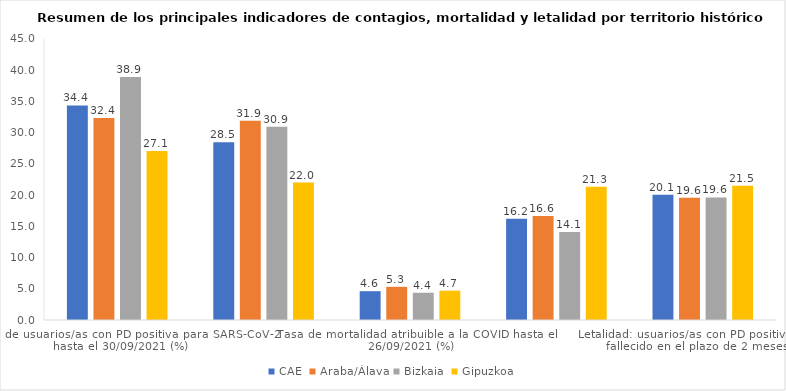
| Category | CAE | Araba/Álava | Bizkaia | Gipuzkoa |
|---|---|---|---|---|
| Tasa de usuarios/as con PD positiva para SARS-CoV-2 hasta el 30/09/2021 (%) | 34.355 | 32.359 | 38.903 | 27.073 |
| Tasa de mortalidad por todas las causas hasta el 26/09/2021 (%) | 28.461 | 31.927 | 30.934 | 22.016 |
| Tasa de mortalidad atribuible a la COVID hasta el 26/09/2021 (%) | 4.614 | 5.313 | 4.362 | 4.695 |
| Proporción de los fallecimientos totales atribuibles a la COVID hasta el 26/09/2021 (%) | 16.21 | 16.64 | 14.101 | 21.325 |
| Letalidad: usuarios/as con PD positiva que han fallecido en el plazo de 2 meses (%) | 20.055 | 19.56 | 19.631 | 21.498 |